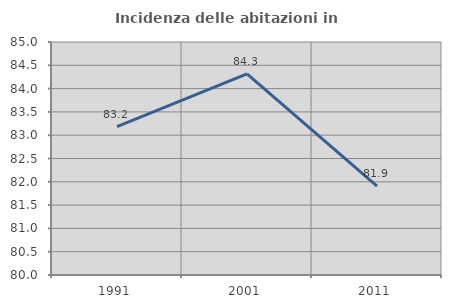
| Category | Incidenza delle abitazioni in proprietà  |
|---|---|
| 1991.0 | 83.186 |
| 2001.0 | 84.314 |
| 2011.0 | 81.905 |